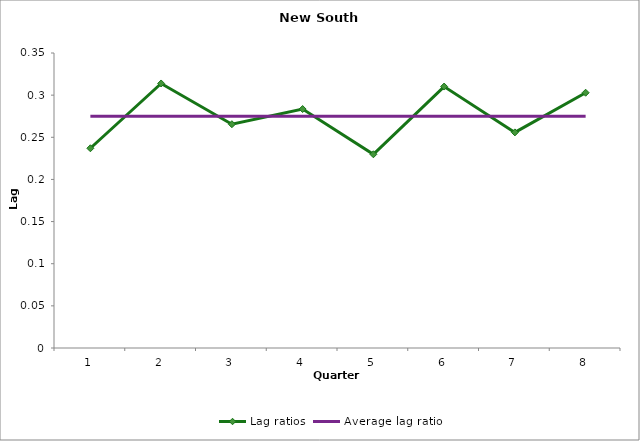
| Category | Lag ratios | Average lag ratio |
|---|---|---|
| 0 | 0.237 | 0.275 |
| 1 | 0.314 | 0.275 |
| 2 | 0.266 | 0.275 |
| 3 | 0.284 | 0.275 |
| 4 | 0.23 | 0.275 |
| 5 | 0.31 | 0.275 |
| 6 | 0.256 | 0.275 |
| 7 | 0.303 | 0.275 |